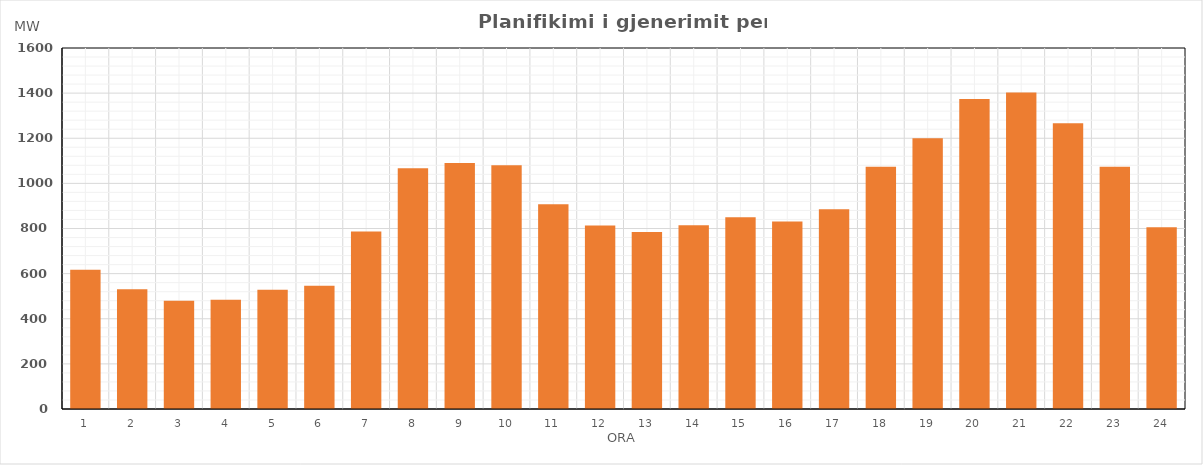
| Category | Max (MW) |
|---|---|
| 0 | 617.08 |
| 1 | 530.99 |
| 2 | 479.82 |
| 3 | 484.53 |
| 4 | 528.27 |
| 5 | 546.79 |
| 6 | 787.2 |
| 7 | 1067.23 |
| 8 | 1090.04 |
| 9 | 1080.61 |
| 10 | 907.44 |
| 11 | 813.72 |
| 12 | 784.29 |
| 13 | 814.31 |
| 14 | 849.69 |
| 15 | 831.36 |
| 16 | 885.45 |
| 17 | 1074.04 |
| 18 | 1199.56 |
| 19 | 1373.82 |
| 20 | 1403.3 |
| 21 | 1266.59 |
| 22 | 1073.92 |
| 23 | 805.46 |